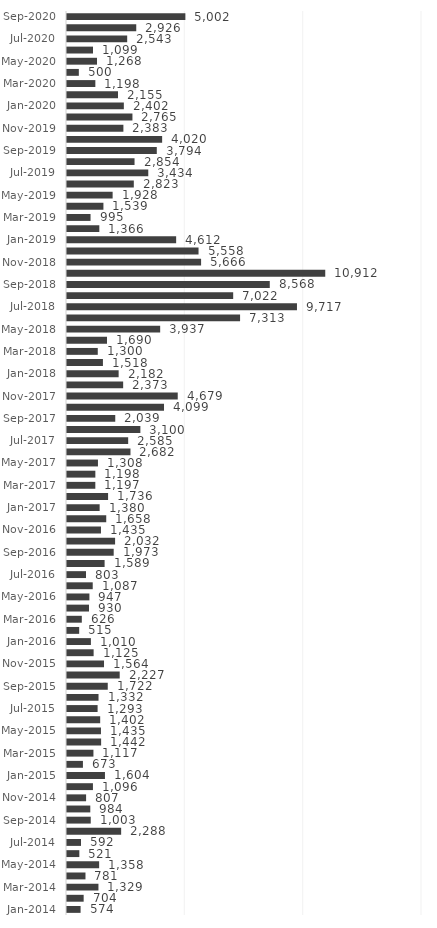
| Category | Series 0 |
|---|---|
| Jan-2014 | 574 |
| Feb-2014 | 704 |
| Mar-2014 | 1329 |
| Apr-2014 | 781 |
| May-2014 | 1358 |
| Jun-2014 | 521 |
| Jul-2014 | 592 |
| Aug-2014 | 2288 |
| Sep-2014 | 1003 |
| Oct-2014 | 984 |
| Nov-2014 | 807 |
| Dec-2014 | 1096 |
| Jan-2015 | 1604 |
| Feb-2015 | 673 |
| Mar-2015 | 1117 |
| Apr-2015 | 1442 |
| May-2015 | 1435 |
| Jun-2015 | 1402 |
| Jul-2015 | 1293 |
| Aug-2015 | 1332 |
| Sep-2015 | 1722 |
| Oct-2015 | 2227 |
| Nov-2015 | 1564 |
| Dec-2015 | 1125 |
| Jan-2016 | 1010 |
| Feb-2016 | 515 |
| Mar-2016 | 626 |
| Apr-2016 | 930 |
| May-2016 | 947 |
| Jun-2016 | 1087 |
| Jul-2016 | 803 |
| Aug-2016 | 1589 |
| Sep-2016 | 1973 |
| Oct-2016 | 2032 |
| Nov-2016 | 1435 |
| Dec-2016 | 1658 |
| Jan-2017 | 1380 |
| Feb-2017 | 1736 |
| Mar-2017 | 1197 |
| Apr-2017 | 1198 |
| May-2017 | 1308 |
| Jun-2017 | 2682 |
| Jul-2017 | 2585 |
| Aug-2017 | 3100 |
| Sep-2017 | 2039 |
| Oct-2017 | 4099 |
| Nov-2017 | 4679 |
| Dec-2017 | 2373 |
| Jan-2018 | 2182 |
| Feb-2018 | 1518 |
| Mar-2018 | 1300 |
| Apr-2018 | 1690 |
| May-2018 | 3937 |
| Jun-2018 | 7313 |
| Jul-2018 | 9717 |
| Aug-2018 | 7022 |
| Sep-2018 | 8568 |
| Oct-2018 | 10912 |
| Nov-2018 | 5666 |
| Dec-2018 | 5558 |
| Jan-2019 | 4612 |
| Feb-2019 | 1366 |
| Mar-2019 | 995 |
| Apr-2019 | 1539 |
| May-2019 | 1928 |
| Jun-2019 | 2823 |
| Jul-2019 | 3434 |
| Aug-2019 | 2854 |
| Sep-2019 | 3794 |
| Oct-2019 | 4020 |
| Nov-2019 | 2383 |
| Dec-2019 | 2765 |
| Jan-2020 | 2402 |
| Feb-2020 | 2155 |
| Mar-2020 | 1198 |
| Apr-2020 | 500 |
| May-2020 | 1268 |
| Jun-2020 | 1099 |
| Jul-2020 | 2543 |
| Aug-2020 | 2926 |
| Sep-2020 | 5002 |